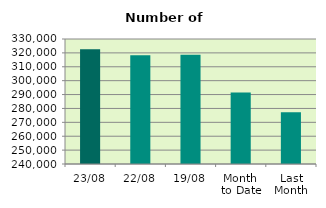
| Category | Series 0 |
|---|---|
| 23/08 | 322678 |
| 22/08 | 318354 |
| 19/08 | 318728 |
| Month 
to Date | 291396.588 |
| Last
Month | 277312.476 |